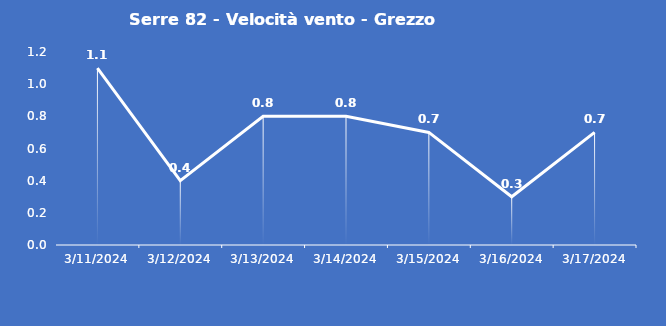
| Category | Serre 82 - Velocità vento - Grezzo (m/s) |
|---|---|
| 3/11/24 | 1.1 |
| 3/12/24 | 0.4 |
| 3/13/24 | 0.8 |
| 3/14/24 | 0.8 |
| 3/15/24 | 0.7 |
| 3/16/24 | 0.3 |
| 3/17/24 | 0.7 |